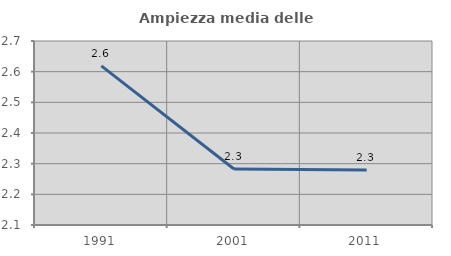
| Category | Ampiezza media delle famiglie |
|---|---|
| 1991.0 | 2.619 |
| 2001.0 | 2.283 |
| 2011.0 | 2.279 |